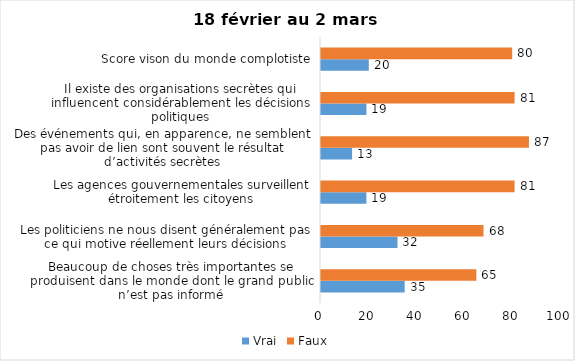
| Category | Vrai | Faux |
|---|---|---|
| Beaucoup de choses très importantes se produisent dans le monde dont le grand public n’est pas informé | 35 | 65 |
| Les politiciens ne nous disent généralement pas ce qui motive réellement leurs décisions | 32 | 68 |
| Les agences gouvernementales surveillent étroitement les citoyens | 19 | 81 |
| Des événements qui, en apparence, ne semblent pas avoir de lien sont souvent le résultat d’activités secrètes | 13 | 87 |
| Il existe des organisations secrètes qui influencent considérablement les décisions politiques | 19 | 81 |
| Score vison du monde complotiste | 20 | 80 |